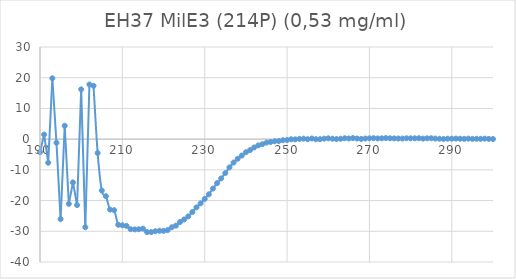
| Category | Series 0 |
|---|---|
| 300.0 | 0.045 |
| 299.0 | 0.077 |
| 298.0 | 0.166 |
| 297.0 | 0.101 |
| 296.0 | 0.119 |
| 295.0 | 0.088 |
| 294.0 | 0.171 |
| 293.0 | 0.09 |
| 292.0 | 0.13 |
| 291.0 | 0.172 |
| 290.0 | 0.133 |
| 289.0 | 0.147 |
| 288.0 | 0.066 |
| 287.0 | 0.116 |
| 286.0 | 0.183 |
| 285.0 | 0.297 |
| 284.0 | 0.266 |
| 283.0 | 0.173 |
| 282.0 | 0.302 |
| 281.0 | 0.27 |
| 280.0 | 0.261 |
| 279.0 | 0.288 |
| 278.0 | 0.186 |
| 277.0 | 0.206 |
| 276.0 | 0.244 |
| 275.0 | 0.279 |
| 274.0 | 0.343 |
| 273.0 | 0.267 |
| 272.0 | 0.23 |
| 271.0 | 0.315 |
| 270.0 | 0.266 |
| 269.0 | 0.198 |
| 268.0 | 0.069 |
| 267.0 | 0.206 |
| 266.0 | 0.343 |
| 265.0 | 0.215 |
| 264.0 | 0.297 |
| 263.0 | 0.126 |
| 262.0 | 0.033 |
| 261.0 | 0.14 |
| 260.0 | 0.266 |
| 259.0 | 0.159 |
| 258.0 | -0.016 |
| 257.0 | -0.022 |
| 256.0 | 0.212 |
| 255.0 | -0.009 |
| 254.0 | 0.161 |
| 253.0 | 0.078 |
| 252.0 | -0.058 |
| 251.0 | -0.051 |
| 250.0 | -0.279 |
| 249.0 | -0.355 |
| 248.0 | -0.614 |
| 247.0 | -0.691 |
| 246.0 | -0.925 |
| 245.0 | -1.127 |
| 244.0 | -1.657 |
| 243.0 | -2.043 |
| 242.0 | -2.724 |
| 241.0 | -3.578 |
| 240.0 | -4.269 |
| 239.0 | -5.34 |
| 238.0 | -6.402 |
| 237.0 | -7.632 |
| 236.0 | -9.201 |
| 235.0 | -11.036 |
| 234.0 | -12.779 |
| 233.0 | -14.335 |
| 232.0 | -16.096 |
| 231.0 | -17.964 |
| 230.0 | -19.474 |
| 229.0 | -20.906 |
| 228.0 | -22.216 |
| 227.0 | -23.715 |
| 226.0 | -25.145 |
| 225.0 | -26.153 |
| 224.0 | -26.992 |
| 223.0 | -28.173 |
| 222.0 | -28.687 |
| 221.0 | -29.626 |
| 220.0 | -29.852 |
| 219.0 | -29.838 |
| 218.0 | -29.99 |
| 217.0 | -30.268 |
| 216.0 | -30.264 |
| 215.0 | -29.144 |
| 214.0 | -29.331 |
| 213.0 | -29.388 |
| 212.0 | -29.314 |
| 211.0 | -28.239 |
| 210.0 | -28.057 |
| 209.0 | -27.882 |
| 208.0 | -23.132 |
| 207.0 | -22.945 |
| 206.0 | -18.573 |
| 205.0 | -16.73 |
| 204.0 | -4.516 |
| 203.0 | 17.359 |
| 202.0 | 17.799 |
| 201.0 | -28.676 |
| 200.0 | 16.212 |
| 199.0 | -21.481 |
| 198.0 | -14.087 |
| 197.0 | -21.069 |
| 196.0 | 4.356 |
| 195.0 | -26.037 |
| 194.0 | -1.169 |
| 193.0 | 19.805 |
| 192.0 | -7.688 |
| 191.0 | 1.49 |
| 190.0 | -4.227 |